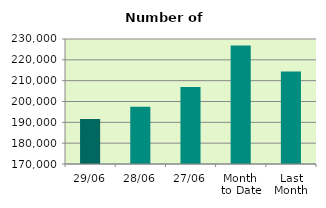
| Category | Series 0 |
|---|---|
| 29/06 | 191588 |
| 28/06 | 197486 |
| 27/06 | 206950 |
| Month 
to Date | 226905.048 |
| Last
Month | 214383.182 |